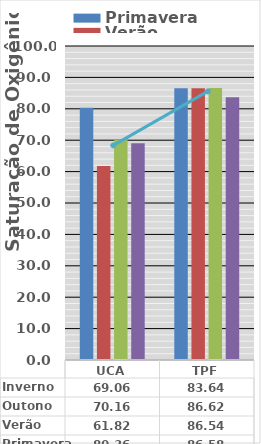
| Category | Primavera | Verão | Outono | Inverno |
|---|---|---|---|---|
| UCA | 80.36 | 61.82 | 70.16 | 69.06 |
| TPF | 86.58 | 86.54 | 86.62 | 83.64 |